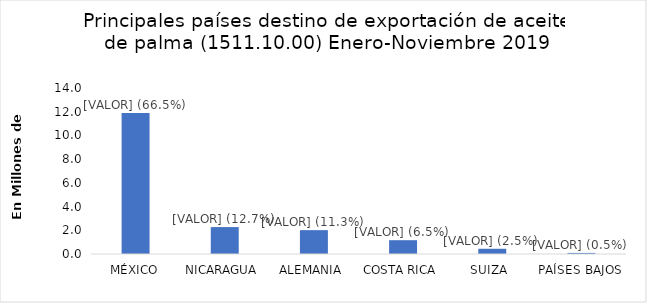
| Category | Series 0 |
|---|---|
| MÉXICO | 11883914 |
| NICARAGUA  | 2270050 |
| ALEMANIA  | 2011116 |
| COSTA RICA  | 1164304 |
| SUIZA  | 439297 |
| PAÍSES BAJOS | 91620 |